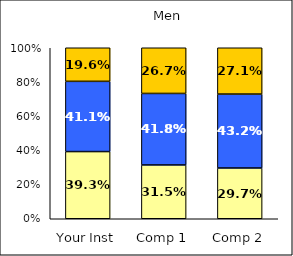
| Category | Low Job Satisfaction: Workplace | Average Job Satisfaction: Workplace | High Job Satisfaction: Workplace |
|---|---|---|---|
| Your Inst | 0.393 | 0.411 | 0.196 |
| Comp 1 | 0.315 | 0.418 | 0.267 |
| Comp 2 | 0.297 | 0.432 | 0.271 |